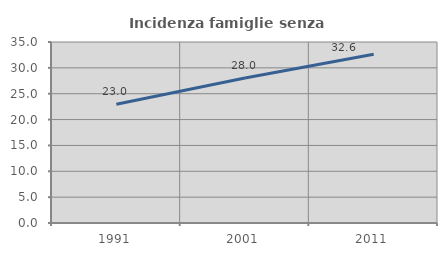
| Category | Incidenza famiglie senza nuclei |
|---|---|
| 1991.0 | 22.971 |
| 2001.0 | 28.022 |
| 2011.0 | 32.642 |